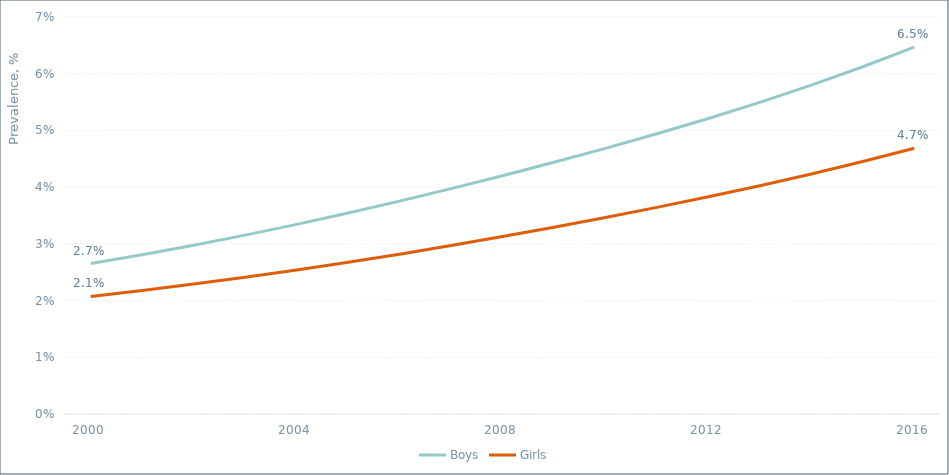
| Category | Boys | Girls |
|---|---|---|
| 2000.0 | 0.027 | 0.021 |
| 2001.0 | 0.028 | 0.022 |
| 2002.0 | 0.03 | 0.023 |
| 2003.0 | 0.032 | 0.024 |
| 2004.0 | 0.033 | 0.025 |
| 2005.0 | 0.035 | 0.027 |
| 2006.0 | 0.038 | 0.028 |
| 2007.0 | 0.04 | 0.03 |
| 2008.0 | 0.042 | 0.031 |
| 2009.0 | 0.044 | 0.033 |
| 2010.0 | 0.047 | 0.035 |
| 2011.0 | 0.049 | 0.036 |
| 2012.0 | 0.052 | 0.038 |
| 2013.0 | 0.055 | 0.04 |
| 2014.0 | 0.058 | 0.042 |
| 2015.0 | 0.061 | 0.045 |
| 2016.0 | 0.065 | 0.047 |